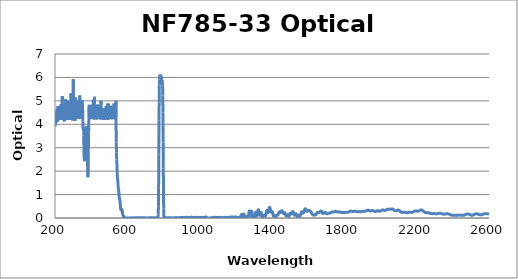
| Category | Optical Density |
|---|---|
| 2600.0 | 0.184 |
| 2599.0 | 0.183 |
| 2598.0 | 0.182 |
| 2597.0 | 0.182 |
| 2596.0 | 0.181 |
| 2595.0 | 0.18 |
| 2594.0 | 0.18 |
| 2593.0 | 0.18 |
| 2592.0 | 0.18 |
| 2591.0 | 0.18 |
| 2590.0 | 0.18 |
| 2589.0 | 0.18 |
| 2588.0 | 0.18 |
| 2587.0 | 0.181 |
| 2586.0 | 0.181 |
| 2585.0 | 0.182 |
| 2584.0 | 0.182 |
| 2583.0 | 0.182 |
| 2582.0 | 0.182 |
| 2581.0 | 0.182 |
| 2580.0 | 0.182 |
| 2579.0 | 0.181 |
| 2578.0 | 0.18 |
| 2577.0 | 0.18 |
| 2576.0 | 0.179 |
| 2575.0 | 0.178 |
| 2574.0 | 0.177 |
| 2573.0 | 0.175 |
| 2572.0 | 0.174 |
| 2571.0 | 0.172 |
| 2570.0 | 0.169 |
| 2569.0 | 0.167 |
| 2568.0 | 0.164 |
| 2567.0 | 0.161 |
| 2566.0 | 0.158 |
| 2565.0 | 0.155 |
| 2564.0 | 0.152 |
| 2563.0 | 0.149 |
| 2562.0 | 0.147 |
| 2561.0 | 0.145 |
| 2560.0 | 0.143 |
| 2559.0 | 0.141 |
| 2558.0 | 0.139 |
| 2557.0 | 0.138 |
| 2556.0 | 0.137 |
| 2555.0 | 0.137 |
| 2554.0 | 0.136 |
| 2553.0 | 0.136 |
| 2552.0 | 0.137 |
| 2551.0 | 0.138 |
| 2550.0 | 0.139 |
| 2549.0 | 0.141 |
| 2548.0 | 0.143 |
| 2547.0 | 0.145 |
| 2546.0 | 0.147 |
| 2545.0 | 0.15 |
| 2544.0 | 0.152 |
| 2543.0 | 0.155 |
| 2542.0 | 0.158 |
| 2541.0 | 0.161 |
| 2540.0 | 0.163 |
| 2539.0 | 0.166 |
| 2538.0 | 0.169 |
| 2537.0 | 0.171 |
| 2536.0 | 0.173 |
| 2535.0 | 0.175 |
| 2534.0 | 0.177 |
| 2533.0 | 0.178 |
| 2532.0 | 0.179 |
| 2531.0 | 0.18 |
| 2530.0 | 0.18 |
| 2529.0 | 0.18 |
| 2528.0 | 0.178 |
| 2527.0 | 0.177 |
| 2526.0 | 0.176 |
| 2525.0 | 0.174 |
| 2524.0 | 0.172 |
| 2523.0 | 0.169 |
| 2522.0 | 0.166 |
| 2521.0 | 0.163 |
| 2520.0 | 0.159 |
| 2519.0 | 0.155 |
| 2518.0 | 0.151 |
| 2517.0 | 0.147 |
| 2516.0 | 0.143 |
| 2515.0 | 0.139 |
| 2514.0 | 0.135 |
| 2513.0 | 0.132 |
| 2512.0 | 0.129 |
| 2511.0 | 0.126 |
| 2510.0 | 0.124 |
| 2509.0 | 0.122 |
| 2508.0 | 0.12 |
| 2507.0 | 0.119 |
| 2506.0 | 0.119 |
| 2505.0 | 0.119 |
| 2504.0 | 0.12 |
| 2503.0 | 0.121 |
| 2502.0 | 0.123 |
| 2501.0 | 0.125 |
| 2500.0 | 0.127 |
| 2499.0 | 0.13 |
| 2498.0 | 0.133 |
| 2497.0 | 0.137 |
| 2496.0 | 0.14 |
| 2495.0 | 0.144 |
| 2494.0 | 0.148 |
| 2493.0 | 0.151 |
| 2492.0 | 0.155 |
| 2491.0 | 0.159 |
| 2490.0 | 0.162 |
| 2489.0 | 0.164 |
| 2488.0 | 0.167 |
| 2487.0 | 0.17 |
| 2486.0 | 0.172 |
| 2485.0 | 0.173 |
| 2484.0 | 0.174 |
| 2483.0 | 0.175 |
| 2482.0 | 0.175 |
| 2481.0 | 0.175 |
| 2480.0 | 0.174 |
| 2479.0 | 0.173 |
| 2478.0 | 0.171 |
| 2477.0 | 0.169 |
| 2476.0 | 0.167 |
| 2475.0 | 0.164 |
| 2474.0 | 0.161 |
| 2473.0 | 0.157 |
| 2472.0 | 0.154 |
| 2471.0 | 0.15 |
| 2470.0 | 0.146 |
| 2469.0 | 0.143 |
| 2468.0 | 0.139 |
| 2467.0 | 0.135 |
| 2466.0 | 0.132 |
| 2465.0 | 0.128 |
| 2464.0 | 0.125 |
| 2463.0 | 0.122 |
| 2462.0 | 0.12 |
| 2461.0 | 0.118 |
| 2460.0 | 0.116 |
| 2459.0 | 0.115 |
| 2458.0 | 0.113 |
| 2457.0 | 0.113 |
| 2456.0 | 0.112 |
| 2455.0 | 0.112 |
| 2454.0 | 0.112 |
| 2453.0 | 0.113 |
| 2452.0 | 0.113 |
| 2451.0 | 0.114 |
| 2450.0 | 0.115 |
| 2449.0 | 0.116 |
| 2448.0 | 0.117 |
| 2447.0 | 0.118 |
| 2446.0 | 0.119 |
| 2445.0 | 0.12 |
| 2444.0 | 0.12 |
| 2443.0 | 0.121 |
| 2442.0 | 0.122 |
| 2441.0 | 0.123 |
| 2440.0 | 0.123 |
| 2439.0 | 0.124 |
| 2438.0 | 0.124 |
| 2437.0 | 0.124 |
| 2436.0 | 0.124 |
| 2435.0 | 0.124 |
| 2434.0 | 0.123 |
| 2433.0 | 0.123 |
| 2432.0 | 0.122 |
| 2431.0 | 0.121 |
| 2430.0 | 0.12 |
| 2429.0 | 0.12 |
| 2428.0 | 0.119 |
| 2427.0 | 0.118 |
| 2426.0 | 0.118 |
| 2425.0 | 0.117 |
| 2424.0 | 0.117 |
| 2423.0 | 0.117 |
| 2422.0 | 0.116 |
| 2421.0 | 0.116 |
| 2420.0 | 0.116 |
| 2419.0 | 0.116 |
| 2418.0 | 0.116 |
| 2417.0 | 0.116 |
| 2416.0 | 0.115 |
| 2415.0 | 0.115 |
| 2414.0 | 0.116 |
| 2413.0 | 0.116 |
| 2412.0 | 0.116 |
| 2411.0 | 0.116 |
| 2410.0 | 0.116 |
| 2409.0 | 0.116 |
| 2408.0 | 0.116 |
| 2407.0 | 0.116 |
| 2406.0 | 0.116 |
| 2405.0 | 0.116 |
| 2404.0 | 0.116 |
| 2403.0 | 0.116 |
| 2402.0 | 0.116 |
| 2401.0 | 0.116 |
| 2400.0 | 0.117 |
| 2399.0 | 0.117 |
| 2398.0 | 0.117 |
| 2397.0 | 0.118 |
| 2396.0 | 0.119 |
| 2395.0 | 0.12 |
| 2394.0 | 0.122 |
| 2393.0 | 0.123 |
| 2392.0 | 0.125 |
| 2391.0 | 0.127 |
| 2390.0 | 0.13 |
| 2389.0 | 0.132 |
| 2388.0 | 0.135 |
| 2387.0 | 0.139 |
| 2386.0 | 0.142 |
| 2385.0 | 0.145 |
| 2384.0 | 0.149 |
| 2383.0 | 0.152 |
| 2382.0 | 0.156 |
| 2381.0 | 0.159 |
| 2380.0 | 0.163 |
| 2379.0 | 0.166 |
| 2378.0 | 0.17 |
| 2377.0 | 0.172 |
| 2376.0 | 0.175 |
| 2375.0 | 0.177 |
| 2374.0 | 0.179 |
| 2373.0 | 0.181 |
| 2372.0 | 0.183 |
| 2371.0 | 0.184 |
| 2370.0 | 0.184 |
| 2369.0 | 0.184 |
| 2368.0 | 0.184 |
| 2367.0 | 0.183 |
| 2366.0 | 0.183 |
| 2365.0 | 0.181 |
| 2364.0 | 0.18 |
| 2363.0 | 0.178 |
| 2362.0 | 0.176 |
| 2361.0 | 0.174 |
| 2360.0 | 0.172 |
| 2359.0 | 0.169 |
| 2358.0 | 0.167 |
| 2357.0 | 0.165 |
| 2356.0 | 0.164 |
| 2355.0 | 0.162 |
| 2354.0 | 0.161 |
| 2353.0 | 0.16 |
| 2352.0 | 0.159 |
| 2351.0 | 0.159 |
| 2350.0 | 0.16 |
| 2349.0 | 0.16 |
| 2348.0 | 0.162 |
| 2347.0 | 0.163 |
| 2346.0 | 0.165 |
| 2345.0 | 0.167 |
| 2344.0 | 0.17 |
| 2343.0 | 0.173 |
| 2342.0 | 0.176 |
| 2341.0 | 0.179 |
| 2340.0 | 0.182 |
| 2339.0 | 0.185 |
| 2338.0 | 0.188 |
| 2337.0 | 0.191 |
| 2336.0 | 0.193 |
| 2335.0 | 0.196 |
| 2334.0 | 0.198 |
| 2333.0 | 0.2 |
| 2332.0 | 0.201 |
| 2331.0 | 0.202 |
| 2330.0 | 0.203 |
| 2329.0 | 0.203 |
| 2328.0 | 0.203 |
| 2327.0 | 0.203 |
| 2326.0 | 0.202 |
| 2325.0 | 0.201 |
| 2324.0 | 0.2 |
| 2323.0 | 0.198 |
| 2322.0 | 0.196 |
| 2321.0 | 0.194 |
| 2320.0 | 0.192 |
| 2319.0 | 0.19 |
| 2318.0 | 0.188 |
| 2317.0 | 0.186 |
| 2316.0 | 0.184 |
| 2315.0 | 0.183 |
| 2314.0 | 0.181 |
| 2313.0 | 0.18 |
| 2312.0 | 0.179 |
| 2311.0 | 0.178 |
| 2310.0 | 0.178 |
| 2309.0 | 0.178 |
| 2308.0 | 0.178 |
| 2307.0 | 0.179 |
| 2306.0 | 0.179 |
| 2305.0 | 0.18 |
| 2304.0 | 0.181 |
| 2303.0 | 0.182 |
| 2302.0 | 0.183 |
| 2301.0 | 0.184 |
| 2300.0 | 0.185 |
| 2299.0 | 0.186 |
| 2298.0 | 0.187 |
| 2297.0 | 0.187 |
| 2296.0 | 0.188 |
| 2295.0 | 0.188 |
| 2294.0 | 0.188 |
| 2293.0 | 0.188 |
| 2292.0 | 0.188 |
| 2291.0 | 0.188 |
| 2290.0 | 0.187 |
| 2289.0 | 0.187 |
| 2288.0 | 0.186 |
| 2287.0 | 0.186 |
| 2286.0 | 0.186 |
| 2285.0 | 0.186 |
| 2284.0 | 0.186 |
| 2283.0 | 0.186 |
| 2282.0 | 0.186 |
| 2281.0 | 0.187 |
| 2280.0 | 0.188 |
| 2279.0 | 0.19 |
| 2278.0 | 0.191 |
| 2277.0 | 0.193 |
| 2276.0 | 0.196 |
| 2275.0 | 0.198 |
| 2274.0 | 0.201 |
| 2273.0 | 0.204 |
| 2272.0 | 0.208 |
| 2271.0 | 0.211 |
| 2270.0 | 0.214 |
| 2269.0 | 0.217 |
| 2268.0 | 0.219 |
| 2267.0 | 0.222 |
| 2266.0 | 0.224 |
| 2265.0 | 0.226 |
| 2264.0 | 0.227 |
| 2263.0 | 0.228 |
| 2262.0 | 0.229 |
| 2261.0 | 0.229 |
| 2260.0 | 0.229 |
| 2259.0 | 0.229 |
| 2258.0 | 0.229 |
| 2257.0 | 0.228 |
| 2256.0 | 0.227 |
| 2255.0 | 0.226 |
| 2254.0 | 0.226 |
| 2253.0 | 0.226 |
| 2252.0 | 0.226 |
| 2251.0 | 0.226 |
| 2250.0 | 0.227 |
| 2249.0 | 0.228 |
| 2248.0 | 0.23 |
| 2247.0 | 0.232 |
| 2246.0 | 0.235 |
| 2245.0 | 0.239 |
| 2244.0 | 0.244 |
| 2243.0 | 0.249 |
| 2242.0 | 0.255 |
| 2241.0 | 0.261 |
| 2240.0 | 0.268 |
| 2239.0 | 0.275 |
| 2238.0 | 0.283 |
| 2237.0 | 0.29 |
| 2236.0 | 0.298 |
| 2235.0 | 0.305 |
| 2234.0 | 0.312 |
| 2233.0 | 0.318 |
| 2232.0 | 0.324 |
| 2231.0 | 0.329 |
| 2230.0 | 0.334 |
| 2229.0 | 0.337 |
| 2228.0 | 0.34 |
| 2227.0 | 0.342 |
| 2226.0 | 0.343 |
| 2225.0 | 0.344 |
| 2224.0 | 0.343 |
| 2223.0 | 0.342 |
| 2222.0 | 0.339 |
| 2221.0 | 0.336 |
| 2220.0 | 0.333 |
| 2219.0 | 0.329 |
| 2218.0 | 0.325 |
| 2217.0 | 0.321 |
| 2216.0 | 0.316 |
| 2215.0 | 0.312 |
| 2214.0 | 0.308 |
| 2213.0 | 0.304 |
| 2212.0 | 0.3 |
| 2211.0 | 0.297 |
| 2210.0 | 0.295 |
| 2209.0 | 0.293 |
| 2208.0 | 0.292 |
| 2207.0 | 0.291 |
| 2206.0 | 0.291 |
| 2205.0 | 0.291 |
| 2204.0 | 0.291 |
| 2203.0 | 0.293 |
| 2202.0 | 0.294 |
| 2201.0 | 0.296 |
| 2200.0 | 0.297 |
| 2199.0 | 0.299 |
| 2198.0 | 0.3 |
| 2197.0 | 0.301 |
| 2196.0 | 0.302 |
| 2195.0 | 0.302 |
| 2194.0 | 0.302 |
| 2193.0 | 0.302 |
| 2192.0 | 0.301 |
| 2191.0 | 0.3 |
| 2190.0 | 0.297 |
| 2189.0 | 0.295 |
| 2188.0 | 0.292 |
| 2187.0 | 0.288 |
| 2186.0 | 0.284 |
| 2185.0 | 0.28 |
| 2184.0 | 0.275 |
| 2183.0 | 0.27 |
| 2182.0 | 0.266 |
| 2181.0 | 0.261 |
| 2180.0 | 0.257 |
| 2179.0 | 0.253 |
| 2178.0 | 0.249 |
| 2177.0 | 0.245 |
| 2176.0 | 0.243 |
| 2175.0 | 0.241 |
| 2174.0 | 0.239 |
| 2173.0 | 0.238 |
| 2172.0 | 0.237 |
| 2171.0 | 0.238 |
| 2170.0 | 0.238 |
| 2169.0 | 0.239 |
| 2168.0 | 0.24 |
| 2167.0 | 0.241 |
| 2166.0 | 0.242 |
| 2165.0 | 0.244 |
| 2164.0 | 0.245 |
| 2163.0 | 0.246 |
| 2162.0 | 0.247 |
| 2161.0 | 0.247 |
| 2160.0 | 0.247 |
| 2159.0 | 0.247 |
| 2158.0 | 0.246 |
| 2157.0 | 0.245 |
| 2156.0 | 0.243 |
| 2155.0 | 0.241 |
| 2154.0 | 0.239 |
| 2153.0 | 0.237 |
| 2152.0 | 0.234 |
| 2151.0 | 0.232 |
| 2150.0 | 0.23 |
| 2149.0 | 0.228 |
| 2148.0 | 0.226 |
| 2147.0 | 0.225 |
| 2146.0 | 0.224 |
| 2145.0 | 0.224 |
| 2144.0 | 0.224 |
| 2143.0 | 0.225 |
| 2142.0 | 0.226 |
| 2141.0 | 0.228 |
| 2140.0 | 0.23 |
| 2139.0 | 0.232 |
| 2138.0 | 0.235 |
| 2137.0 | 0.237 |
| 2136.0 | 0.239 |
| 2135.0 | 0.242 |
| 2134.0 | 0.244 |
| 2133.0 | 0.245 |
| 2132.0 | 0.246 |
| 2131.0 | 0.247 |
| 2130.0 | 0.248 |
| 2129.0 | 0.248 |
| 2128.0 | 0.247 |
| 2127.0 | 0.246 |
| 2126.0 | 0.245 |
| 2125.0 | 0.244 |
| 2124.0 | 0.242 |
| 2123.0 | 0.24 |
| 2122.0 | 0.239 |
| 2121.0 | 0.237 |
| 2120.0 | 0.237 |
| 2119.0 | 0.236 |
| 2118.0 | 0.237 |
| 2117.0 | 0.238 |
| 2116.0 | 0.24 |
| 2115.0 | 0.243 |
| 2114.0 | 0.247 |
| 2113.0 | 0.252 |
| 2112.0 | 0.258 |
| 2111.0 | 0.264 |
| 2110.0 | 0.271 |
| 2109.0 | 0.278 |
| 2108.0 | 0.286 |
| 2107.0 | 0.294 |
| 2106.0 | 0.301 |
| 2105.0 | 0.308 |
| 2104.0 | 0.315 |
| 2103.0 | 0.321 |
| 2102.0 | 0.326 |
| 2101.0 | 0.33 |
| 2100.0 | 0.334 |
| 2099.0 | 0.336 |
| 2098.0 | 0.337 |
| 2097.0 | 0.337 |
| 2096.0 | 0.337 |
| 2095.0 | 0.336 |
| 2094.0 | 0.334 |
| 2093.0 | 0.331 |
| 2092.0 | 0.328 |
| 2091.0 | 0.324 |
| 2090.0 | 0.32 |
| 2089.0 | 0.317 |
| 2088.0 | 0.314 |
| 2087.0 | 0.311 |
| 2086.0 | 0.308 |
| 2085.0 | 0.307 |
| 2084.0 | 0.306 |
| 2083.0 | 0.306 |
| 2082.0 | 0.308 |
| 2081.0 | 0.31 |
| 2080.0 | 0.313 |
| 2079.0 | 0.317 |
| 2078.0 | 0.322 |
| 2077.0 | 0.327 |
| 2076.0 | 0.333 |
| 2075.0 | 0.339 |
| 2074.0 | 0.346 |
| 2073.0 | 0.352 |
| 2072.0 | 0.358 |
| 2071.0 | 0.363 |
| 2070.0 | 0.368 |
| 2069.0 | 0.373 |
| 2068.0 | 0.376 |
| 2067.0 | 0.379 |
| 2066.0 | 0.381 |
| 2065.0 | 0.382 |
| 2064.0 | 0.383 |
| 2063.0 | 0.383 |
| 2062.0 | 0.383 |
| 2061.0 | 0.381 |
| 2060.0 | 0.38 |
| 2059.0 | 0.379 |
| 2058.0 | 0.378 |
| 2057.0 | 0.376 |
| 2056.0 | 0.375 |
| 2055.0 | 0.374 |
| 2054.0 | 0.373 |
| 2053.0 | 0.373 |
| 2052.0 | 0.373 |
| 2051.0 | 0.373 |
| 2050.0 | 0.374 |
| 2049.0 | 0.375 |
| 2048.0 | 0.376 |
| 2047.0 | 0.377 |
| 2046.0 | 0.377 |
| 2045.0 | 0.378 |
| 2044.0 | 0.379 |
| 2043.0 | 0.379 |
| 2042.0 | 0.379 |
| 2041.0 | 0.378 |
| 2040.0 | 0.377 |
| 2039.0 | 0.375 |
| 2038.0 | 0.372 |
| 2037.0 | 0.368 |
| 2036.0 | 0.364 |
| 2035.0 | 0.36 |
| 2034.0 | 0.356 |
| 2033.0 | 0.351 |
| 2032.0 | 0.346 |
| 2031.0 | 0.341 |
| 2030.0 | 0.337 |
| 2029.0 | 0.332 |
| 2028.0 | 0.329 |
| 2027.0 | 0.327 |
| 2026.0 | 0.325 |
| 2025.0 | 0.324 |
| 2024.0 | 0.324 |
| 2023.0 | 0.325 |
| 2022.0 | 0.326 |
| 2021.0 | 0.329 |
| 2020.0 | 0.331 |
| 2019.0 | 0.334 |
| 2018.0 | 0.337 |
| 2017.0 | 0.34 |
| 2016.0 | 0.342 |
| 2015.0 | 0.344 |
| 2014.0 | 0.345 |
| 2013.0 | 0.346 |
| 2012.0 | 0.346 |
| 2011.0 | 0.345 |
| 2010.0 | 0.343 |
| 2009.0 | 0.341 |
| 2008.0 | 0.338 |
| 2007.0 | 0.333 |
| 2006.0 | 0.329 |
| 2005.0 | 0.323 |
| 2004.0 | 0.318 |
| 2003.0 | 0.312 |
| 2002.0 | 0.307 |
| 2001.0 | 0.301 |
| 2000.0 | 0.297 |
| 1999.0 | 0.293 |
| 1998.0 | 0.289 |
| 1997.0 | 0.287 |
| 1996.0 | 0.286 |
| 1995.0 | 0.287 |
| 1994.0 | 0.288 |
| 1993.0 | 0.29 |
| 1992.0 | 0.292 |
| 1991.0 | 0.295 |
| 1990.0 | 0.299 |
| 1989.0 | 0.302 |
| 1988.0 | 0.305 |
| 1987.0 | 0.308 |
| 1986.0 | 0.311 |
| 1985.0 | 0.313 |
| 1984.0 | 0.313 |
| 1983.0 | 0.314 |
| 1982.0 | 0.313 |
| 1981.0 | 0.311 |
| 1980.0 | 0.309 |
| 1979.0 | 0.306 |
| 1978.0 | 0.302 |
| 1977.0 | 0.298 |
| 1976.0 | 0.294 |
| 1975.0 | 0.29 |
| 1974.0 | 0.287 |
| 1973.0 | 0.284 |
| 1972.0 | 0.282 |
| 1971.0 | 0.28 |
| 1970.0 | 0.279 |
| 1969.0 | 0.28 |
| 1968.0 | 0.281 |
| 1967.0 | 0.283 |
| 1966.0 | 0.286 |
| 1965.0 | 0.289 |
| 1964.0 | 0.293 |
| 1963.0 | 0.297 |
| 1962.0 | 0.301 |
| 1961.0 | 0.306 |
| 1960.0 | 0.31 |
| 1959.0 | 0.313 |
| 1958.0 | 0.316 |
| 1957.0 | 0.318 |
| 1956.0 | 0.319 |
| 1955.0 | 0.319 |
| 1954.0 | 0.319 |
| 1953.0 | 0.318 |
| 1952.0 | 0.317 |
| 1951.0 | 0.315 |
| 1950.0 | 0.312 |
| 1949.0 | 0.31 |
| 1948.0 | 0.307 |
| 1947.0 | 0.306 |
| 1946.0 | 0.304 |
| 1945.0 | 0.304 |
| 1944.0 | 0.304 |
| 1943.0 | 0.304 |
| 1942.0 | 0.305 |
| 1941.0 | 0.307 |
| 1940.0 | 0.31 |
| 1939.0 | 0.313 |
| 1938.0 | 0.317 |
| 1937.0 | 0.321 |
| 1936.0 | 0.324 |
| 1935.0 | 0.327 |
| 1934.0 | 0.33 |
| 1933.0 | 0.332 |
| 1932.0 | 0.334 |
| 1931.0 | 0.334 |
| 1930.0 | 0.335 |
| 1929.0 | 0.334 |
| 1928.0 | 0.333 |
| 1927.0 | 0.331 |
| 1926.0 | 0.328 |
| 1925.0 | 0.324 |
| 1924.0 | 0.321 |
| 1923.0 | 0.316 |
| 1922.0 | 0.312 |
| 1921.0 | 0.308 |
| 1920.0 | 0.304 |
| 1919.0 | 0.301 |
| 1918.0 | 0.298 |
| 1917.0 | 0.295 |
| 1916.0 | 0.292 |
| 1915.0 | 0.291 |
| 1914.0 | 0.29 |
| 1913.0 | 0.29 |
| 1912.0 | 0.29 |
| 1911.0 | 0.291 |
| 1910.0 | 0.291 |
| 1909.0 | 0.29 |
| 1908.0 | 0.289 |
| 1907.0 | 0.289 |
| 1906.0 | 0.289 |
| 1905.0 | 0.288 |
| 1904.0 | 0.287 |
| 1903.0 | 0.286 |
| 1902.0 | 0.284 |
| 1901.0 | 0.281 |
| 1900.0 | 0.279 |
| 1899.0 | 0.276 |
| 1898.0 | 0.274 |
| 1897.0 | 0.272 |
| 1896.0 | 0.27 |
| 1895.0 | 0.268 |
| 1894.0 | 0.267 |
| 1893.0 | 0.266 |
| 1892.0 | 0.266 |
| 1891.0 | 0.267 |
| 1890.0 | 0.268 |
| 1889.0 | 0.269 |
| 1888.0 | 0.27 |
| 1887.0 | 0.27 |
| 1886.0 | 0.271 |
| 1885.0 | 0.272 |
| 1884.0 | 0.273 |
| 1883.0 | 0.273 |
| 1882.0 | 0.273 |
| 1881.0 | 0.273 |
| 1880.0 | 0.272 |
| 1879.0 | 0.27 |
| 1878.0 | 0.269 |
| 1877.0 | 0.267 |
| 1876.0 | 0.266 |
| 1875.0 | 0.265 |
| 1874.0 | 0.265 |
| 1873.0 | 0.265 |
| 1872.0 | 0.266 |
| 1871.0 | 0.267 |
| 1870.0 | 0.268 |
| 1869.0 | 0.271 |
| 1868.0 | 0.273 |
| 1867.0 | 0.275 |
| 1866.0 | 0.278 |
| 1865.0 | 0.28 |
| 1864.0 | 0.282 |
| 1863.0 | 0.284 |
| 1862.0 | 0.286 |
| 1861.0 | 0.288 |
| 1860.0 | 0.29 |
| 1859.0 | 0.292 |
| 1858.0 | 0.292 |
| 1857.0 | 0.291 |
| 1856.0 | 0.29 |
| 1855.0 | 0.288 |
| 1854.0 | 0.286 |
| 1853.0 | 0.284 |
| 1852.0 | 0.283 |
| 1851.0 | 0.281 |
| 1850.0 | 0.278 |
| 1849.0 | 0.277 |
| 1848.0 | 0.276 |
| 1847.0 | 0.278 |
| 1846.0 | 0.28 |
| 1845.0 | 0.281 |
| 1844.0 | 0.281 |
| 1843.0 | 0.282 |
| 1842.0 | 0.283 |
| 1841.0 | 0.287 |
| 1840.0 | 0.29 |
| 1839.0 | 0.294 |
| 1838.0 | 0.295 |
| 1837.0 | 0.296 |
| 1836.0 | 0.296 |
| 1835.0 | 0.296 |
| 1834.0 | 0.295 |
| 1833.0 | 0.293 |
| 1832.0 | 0.289 |
| 1831.0 | 0.285 |
| 1830.0 | 0.282 |
| 1829.0 | 0.278 |
| 1828.0 | 0.274 |
| 1827.0 | 0.269 |
| 1826.0 | 0.264 |
| 1825.0 | 0.26 |
| 1824.0 | 0.256 |
| 1823.0 | 0.253 |
| 1822.0 | 0.25 |
| 1821.0 | 0.248 |
| 1820.0 | 0.246 |
| 1819.0 | 0.245 |
| 1818.0 | 0.245 |
| 1817.0 | 0.243 |
| 1816.0 | 0.242 |
| 1815.0 | 0.242 |
| 1814.0 | 0.242 |
| 1813.0 | 0.241 |
| 1812.0 | 0.241 |
| 1811.0 | 0.241 |
| 1810.0 | 0.24 |
| 1809.0 | 0.24 |
| 1808.0 | 0.239 |
| 1807.0 | 0.238 |
| 1806.0 | 0.238 |
| 1805.0 | 0.238 |
| 1804.0 | 0.238 |
| 1803.0 | 0.238 |
| 1802.0 | 0.238 |
| 1801.0 | 0.238 |
| 1800.0 | 0.239 |
| 1799.0 | 0.239 |
| 1798.0 | 0.24 |
| 1797.0 | 0.24 |
| 1796.0 | 0.239 |
| 1795.0 | 0.239 |
| 1794.0 | 0.238 |
| 1793.0 | 0.237 |
| 1792.0 | 0.236 |
| 1791.0 | 0.235 |
| 1790.0 | 0.234 |
| 1789.0 | 0.233 |
| 1788.0 | 0.232 |
| 1787.0 | 0.231 |
| 1786.0 | 0.231 |
| 1785.0 | 0.232 |
| 1784.0 | 0.233 |
| 1783.0 | 0.235 |
| 1782.0 | 0.238 |
| 1781.0 | 0.241 |
| 1780.0 | 0.244 |
| 1779.0 | 0.248 |
| 1778.0 | 0.251 |
| 1777.0 | 0.254 |
| 1776.0 | 0.257 |
| 1775.0 | 0.259 |
| 1774.0 | 0.261 |
| 1773.0 | 0.262 |
| 1772.0 | 0.262 |
| 1771.0 | 0.262 |
| 1770.0 | 0.261 |
| 1769.0 | 0.259 |
| 1768.0 | 0.257 |
| 1767.0 | 0.256 |
| 1766.0 | 0.254 |
| 1765.0 | 0.254 |
| 1764.0 | 0.253 |
| 1763.0 | 0.254 |
| 1762.0 | 0.255 |
| 1761.0 | 0.258 |
| 1760.0 | 0.261 |
| 1759.0 | 0.265 |
| 1758.0 | 0.269 |
| 1757.0 | 0.273 |
| 1756.0 | 0.277 |
| 1755.0 | 0.281 |
| 1754.0 | 0.285 |
| 1753.0 | 0.287 |
| 1752.0 | 0.288 |
| 1751.0 | 0.288 |
| 1750.0 | 0.288 |
| 1749.0 | 0.286 |
| 1748.0 | 0.283 |
| 1747.0 | 0.279 |
| 1746.0 | 0.275 |
| 1745.0 | 0.271 |
| 1744.0 | 0.268 |
| 1743.0 | 0.264 |
| 1742.0 | 0.261 |
| 1741.0 | 0.259 |
| 1740.0 | 0.258 |
| 1739.0 | 0.258 |
| 1738.0 | 0.258 |
| 1737.0 | 0.258 |
| 1736.0 | 0.259 |
| 1735.0 | 0.259 |
| 1734.0 | 0.259 |
| 1733.0 | 0.259 |
| 1732.0 | 0.258 |
| 1731.0 | 0.256 |
| 1730.0 | 0.252 |
| 1729.0 | 0.248 |
| 1728.0 | 0.244 |
| 1727.0 | 0.238 |
| 1726.0 | 0.233 |
| 1725.0 | 0.227 |
| 1724.0 | 0.222 |
| 1723.0 | 0.217 |
| 1722.0 | 0.213 |
| 1721.0 | 0.21 |
| 1720.0 | 0.208 |
| 1719.0 | 0.206 |
| 1718.0 | 0.206 |
| 1717.0 | 0.206 |
| 1716.0 | 0.206 |
| 1715.0 | 0.206 |
| 1714.0 | 0.206 |
| 1713.0 | 0.205 |
| 1712.0 | 0.202 |
| 1711.0 | 0.199 |
| 1710.0 | 0.196 |
| 1709.0 | 0.191 |
| 1708.0 | 0.187 |
| 1707.0 | 0.182 |
| 1706.0 | 0.179 |
| 1705.0 | 0.177 |
| 1704.0 | 0.176 |
| 1703.0 | 0.178 |
| 1702.0 | 0.182 |
| 1701.0 | 0.188 |
| 1700.0 | 0.195 |
| 1699.0 | 0.203 |
| 1698.0 | 0.212 |
| 1697.0 | 0.221 |
| 1696.0 | 0.23 |
| 1695.0 | 0.237 |
| 1694.0 | 0.242 |
| 1693.0 | 0.244 |
| 1692.0 | 0.245 |
| 1691.0 | 0.243 |
| 1690.0 | 0.238 |
| 1689.0 | 0.231 |
| 1688.0 | 0.223 |
| 1687.0 | 0.215 |
| 1686.0 | 0.206 |
| 1685.0 | 0.198 |
| 1684.0 | 0.193 |
| 1683.0 | 0.19 |
| 1682.0 | 0.19 |
| 1681.0 | 0.194 |
| 1680.0 | 0.202 |
| 1679.0 | 0.213 |
| 1678.0 | 0.225 |
| 1677.0 | 0.239 |
| 1676.0 | 0.254 |
| 1675.0 | 0.268 |
| 1674.0 | 0.28 |
| 1673.0 | 0.289 |
| 1672.0 | 0.295 |
| 1671.0 | 0.299 |
| 1670.0 | 0.298 |
| 1669.0 | 0.295 |
| 1668.0 | 0.289 |
| 1667.0 | 0.28 |
| 1666.0 | 0.271 |
| 1665.0 | 0.261 |
| 1664.0 | 0.251 |
| 1663.0 | 0.243 |
| 1662.0 | 0.236 |
| 1661.0 | 0.231 |
| 1660.0 | 0.229 |
| 1659.0 | 0.229 |
| 1658.0 | 0.231 |
| 1657.0 | 0.234 |
| 1656.0 | 0.238 |
| 1655.0 | 0.24 |
| 1654.0 | 0.242 |
| 1653.0 | 0.242 |
| 1652.0 | 0.24 |
| 1651.0 | 0.236 |
| 1650.0 | 0.229 |
| 1649.0 | 0.22 |
| 1648.0 | 0.209 |
| 1647.0 | 0.197 |
| 1646.0 | 0.184 |
| 1645.0 | 0.171 |
| 1644.0 | 0.16 |
| 1643.0 | 0.15 |
| 1642.0 | 0.141 |
| 1641.0 | 0.135 |
| 1640.0 | 0.132 |
| 1639.0 | 0.131 |
| 1638.0 | 0.131 |
| 1637.0 | 0.132 |
| 1636.0 | 0.134 |
| 1635.0 | 0.135 |
| 1634.0 | 0.135 |
| 1633.0 | 0.134 |
| 1632.0 | 0.132 |
| 1631.0 | 0.13 |
| 1630.0 | 0.127 |
| 1629.0 | 0.125 |
| 1628.0 | 0.124 |
| 1627.0 | 0.125 |
| 1626.0 | 0.129 |
| 1625.0 | 0.135 |
| 1624.0 | 0.144 |
| 1623.0 | 0.155 |
| 1622.0 | 0.168 |
| 1621.0 | 0.182 |
| 1620.0 | 0.197 |
| 1619.0 | 0.212 |
| 1618.0 | 0.226 |
| 1617.0 | 0.239 |
| 1616.0 | 0.25 |
| 1615.0 | 0.26 |
| 1614.0 | 0.27 |
| 1613.0 | 0.278 |
| 1612.0 | 0.285 |
| 1611.0 | 0.292 |
| 1610.0 | 0.298 |
| 1609.0 | 0.304 |
| 1608.0 | 0.309 |
| 1607.0 | 0.314 |
| 1606.0 | 0.319 |
| 1605.0 | 0.322 |
| 1604.0 | 0.323 |
| 1603.0 | 0.324 |
| 1602.0 | 0.322 |
| 1601.0 | 0.319 |
| 1600.0 | 0.313 |
| 1599.0 | 0.307 |
| 1598.0 | 0.3 |
| 1597.0 | 0.293 |
| 1596.0 | 0.288 |
| 1595.0 | 0.285 |
| 1594.0 | 0.285 |
| 1593.0 | 0.289 |
| 1592.0 | 0.298 |
| 1591.0 | 0.31 |
| 1590.0 | 0.324 |
| 1589.0 | 0.34 |
| 1588.0 | 0.356 |
| 1587.0 | 0.37 |
| 1586.0 | 0.381 |
| 1585.0 | 0.388 |
| 1584.0 | 0.391 |
| 1583.0 | 0.388 |
| 1582.0 | 0.378 |
| 1581.0 | 0.364 |
| 1580.0 | 0.345 |
| 1579.0 | 0.323 |
| 1578.0 | 0.298 |
| 1577.0 | 0.274 |
| 1576.0 | 0.251 |
| 1575.0 | 0.233 |
| 1574.0 | 0.219 |
| 1573.0 | 0.213 |
| 1572.0 | 0.213 |
| 1571.0 | 0.219 |
| 1570.0 | 0.229 |
| 1569.0 | 0.241 |
| 1568.0 | 0.254 |
| 1567.0 | 0.264 |
| 1566.0 | 0.27 |
| 1565.0 | 0.271 |
| 1564.0 | 0.266 |
| 1563.0 | 0.254 |
| 1562.0 | 0.236 |
| 1561.0 | 0.213 |
| 1560.0 | 0.186 |
| 1559.0 | 0.158 |
| 1558.0 | 0.132 |
| 1557.0 | 0.109 |
| 1556.0 | 0.093 |
| 1555.0 | 0.084 |
| 1554.0 | 0.083 |
| 1553.0 | 0.087 |
| 1552.0 | 0.096 |
| 1551.0 | 0.105 |
| 1550.0 | 0.114 |
| 1549.0 | 0.119 |
| 1548.0 | 0.12 |
| 1547.0 | 0.116 |
| 1546.0 | 0.107 |
| 1545.0 | 0.095 |
| 1544.0 | 0.081 |
| 1543.0 | 0.069 |
| 1542.0 | 0.061 |
| 1541.0 | 0.058 |
| 1540.0 | 0.063 |
| 1539.0 | 0.074 |
| 1538.0 | 0.09 |
| 1537.0 | 0.11 |
| 1536.0 | 0.13 |
| 1535.0 | 0.15 |
| 1534.0 | 0.166 |
| 1533.0 | 0.177 |
| 1532.0 | 0.182 |
| 1531.0 | 0.18 |
| 1530.0 | 0.173 |
| 1529.0 | 0.162 |
| 1528.0 | 0.148 |
| 1527.0 | 0.135 |
| 1526.0 | 0.124 |
| 1525.0 | 0.119 |
| 1524.0 | 0.122 |
| 1523.0 | 0.132 |
| 1522.0 | 0.15 |
| 1521.0 | 0.172 |
| 1520.0 | 0.199 |
| 1519.0 | 0.223 |
| 1518.0 | 0.244 |
| 1517.0 | 0.26 |
| 1516.0 | 0.269 |
| 1515.0 | 0.27 |
| 1514.0 | 0.264 |
| 1513.0 | 0.252 |
| 1512.0 | 0.235 |
| 1511.0 | 0.216 |
| 1510.0 | 0.197 |
| 1509.0 | 0.182 |
| 1508.0 | 0.171 |
| 1507.0 | 0.168 |
| 1506.0 | 0.171 |
| 1505.0 | 0.178 |
| 1504.0 | 0.188 |
| 1503.0 | 0.198 |
| 1502.0 | 0.206 |
| 1501.0 | 0.207 |
| 1500.0 | 0.203 |
| 1499.0 | 0.193 |
| 1498.0 | 0.177 |
| 1497.0 | 0.155 |
| 1496.0 | 0.13 |
| 1495.0 | 0.106 |
| 1494.0 | 0.085 |
| 1493.0 | 0.069 |
| 1492.0 | 0.061 |
| 1491.0 | 0.062 |
| 1490.0 | 0.071 |
| 1489.0 | 0.085 |
| 1488.0 | 0.103 |
| 1487.0 | 0.118 |
| 1486.0 | 0.131 |
| 1485.0 | 0.139 |
| 1484.0 | 0.14 |
| 1483.0 | 0.136 |
| 1482.0 | 0.127 |
| 1481.0 | 0.116 |
| 1480.0 | 0.105 |
| 1479.0 | 0.098 |
| 1478.0 | 0.097 |
| 1477.0 | 0.104 |
| 1476.0 | 0.119 |
| 1475.0 | 0.139 |
| 1474.0 | 0.163 |
| 1473.0 | 0.185 |
| 1472.0 | 0.205 |
| 1471.0 | 0.219 |
| 1470.0 | 0.228 |
| 1469.0 | 0.229 |
| 1468.0 | 0.225 |
| 1467.0 | 0.216 |
| 1466.0 | 0.206 |
| 1465.0 | 0.198 |
| 1464.0 | 0.194 |
| 1463.0 | 0.196 |
| 1462.0 | 0.205 |
| 1461.0 | 0.22 |
| 1460.0 | 0.24 |
| 1459.0 | 0.262 |
| 1458.0 | 0.281 |
| 1457.0 | 0.297 |
| 1456.0 | 0.309 |
| 1455.0 | 0.314 |
| 1454.0 | 0.313 |
| 1453.0 | 0.305 |
| 1452.0 | 0.294 |
| 1451.0 | 0.279 |
| 1450.0 | 0.264 |
| 1449.0 | 0.251 |
| 1448.0 | 0.242 |
| 1447.0 | 0.238 |
| 1446.0 | 0.239 |
| 1445.0 | 0.245 |
| 1444.0 | 0.252 |
| 1443.0 | 0.26 |
| 1442.0 | 0.265 |
| 1441.0 | 0.265 |
| 1440.0 | 0.26 |
| 1439.0 | 0.248 |
| 1438.0 | 0.232 |
| 1437.0 | 0.212 |
| 1436.0 | 0.19 |
| 1435.0 | 0.171 |
| 1434.0 | 0.153 |
| 1433.0 | 0.141 |
| 1432.0 | 0.133 |
| 1431.0 | 0.13 |
| 1430.0 | 0.129 |
| 1429.0 | 0.128 |
| 1428.0 | 0.125 |
| 1427.0 | 0.118 |
| 1426.0 | 0.108 |
| 1425.0 | 0.096 |
| 1424.0 | 0.082 |
| 1423.0 | 0.07 |
| 1422.0 | 0.063 |
| 1421.0 | 0.061 |
| 1420.0 | 0.065 |
| 1419.0 | 0.075 |
| 1418.0 | 0.088 |
| 1417.0 | 0.099 |
| 1416.0 | 0.109 |
| 1415.0 | 0.113 |
| 1414.0 | 0.111 |
| 1413.0 | 0.103 |
| 1412.0 | 0.093 |
| 1411.0 | 0.081 |
| 1410.0 | 0.072 |
| 1409.0 | 0.072 |
| 1408.0 | 0.081 |
| 1407.0 | 0.101 |
| 1406.0 | 0.129 |
| 1405.0 | 0.164 |
| 1404.0 | 0.202 |
| 1403.0 | 0.235 |
| 1402.0 | 0.26 |
| 1401.0 | 0.274 |
| 1400.0 | 0.28 |
| 1399.0 | 0.278 |
| 1398.0 | 0.269 |
| 1397.0 | 0.257 |
| 1396.0 | 0.248 |
| 1395.0 | 0.249 |
| 1394.0 | 0.262 |
| 1393.0 | 0.284 |
| 1392.0 | 0.32 |
| 1391.0 | 0.359 |
| 1390.0 | 0.394 |
| 1389.0 | 0.423 |
| 1388.0 | 0.444 |
| 1387.0 | 0.455 |
| 1386.0 | 0.45 |
| 1385.0 | 0.432 |
| 1384.0 | 0.401 |
| 1383.0 | 0.36 |
| 1382.0 | 0.315 |
| 1381.0 | 0.276 |
| 1380.0 | 0.247 |
| 1379.0 | 0.23 |
| 1378.0 | 0.23 |
| 1377.0 | 0.242 |
| 1376.0 | 0.263 |
| 1375.0 | 0.286 |
| 1374.0 | 0.308 |
| 1373.0 | 0.321 |
| 1372.0 | 0.323 |
| 1371.0 | 0.313 |
| 1370.0 | 0.292 |
| 1369.0 | 0.262 |
| 1368.0 | 0.223 |
| 1367.0 | 0.18 |
| 1366.0 | 0.142 |
| 1365.0 | 0.11 |
| 1364.0 | 0.088 |
| 1363.0 | 0.078 |
| 1362.0 | 0.081 |
| 1361.0 | 0.09 |
| 1360.0 | 0.102 |
| 1359.0 | 0.113 |
| 1358.0 | 0.119 |
| 1357.0 | 0.121 |
| 1356.0 | 0.117 |
| 1355.0 | 0.11 |
| 1354.0 | 0.101 |
| 1353.0 | 0.09 |
| 1352.0 | 0.077 |
| 1351.0 | 0.064 |
| 1350.0 | 0.052 |
| 1349.0 | 0.043 |
| 1348.0 | 0.037 |
| 1347.0 | 0.039 |
| 1346.0 | 0.048 |
| 1345.0 | 0.068 |
| 1344.0 | 0.096 |
| 1343.0 | 0.129 |
| 1342.0 | 0.166 |
| 1341.0 | 0.199 |
| 1340.0 | 0.224 |
| 1339.0 | 0.239 |
| 1338.0 | 0.242 |
| 1337.0 | 0.231 |
| 1336.0 | 0.209 |
| 1335.0 | 0.18 |
| 1334.0 | 0.149 |
| 1333.0 | 0.126 |
| 1332.0 | 0.118 |
| 1331.0 | 0.13 |
| 1330.0 | 0.16 |
| 1329.0 | 0.204 |
| 1328.0 | 0.254 |
| 1327.0 | 0.3 |
| 1326.0 | 0.335 |
| 1325.0 | 0.354 |
| 1324.0 | 0.353 |
| 1323.0 | 0.333 |
| 1322.0 | 0.294 |
| 1321.0 | 0.243 |
| 1320.0 | 0.187 |
| 1319.0 | 0.14 |
| 1318.0 | 0.111 |
| 1317.0 | 0.109 |
| 1316.0 | 0.131 |
| 1315.0 | 0.169 |
| 1314.0 | 0.21 |
| 1313.0 | 0.242 |
| 1312.0 | 0.257 |
| 1311.0 | 0.252 |
| 1310.0 | 0.226 |
| 1309.0 | 0.184 |
| 1308.0 | 0.131 |
| 1307.0 | 0.081 |
| 1306.0 | 0.042 |
| 1305.0 | 0.023 |
| 1304.0 | 0.026 |
| 1303.0 | 0.045 |
| 1302.0 | 0.069 |
| 1301.0 | 0.089 |
| 1300.0 | 0.096 |
| 1299.0 | 0.089 |
| 1298.0 | 0.069 |
| 1297.0 | 0.044 |
| 1296.0 | 0.025 |
| 1295.0 | 0.022 |
| 1294.0 | 0.04 |
| 1293.0 | 0.078 |
| 1292.0 | 0.131 |
| 1291.0 | 0.187 |
| 1290.0 | 0.237 |
| 1289.0 | 0.272 |
| 1288.0 | 0.287 |
| 1287.0 | 0.28 |
| 1286.0 | 0.254 |
| 1285.0 | 0.211 |
| 1284.0 | 0.163 |
| 1283.0 | 0.123 |
| 1282.0 | 0.102 |
| 1281.0 | 0.106 |
| 1280.0 | 0.136 |
| 1279.0 | 0.183 |
| 1278.0 | 0.232 |
| 1277.0 | 0.273 |
| 1276.0 | 0.299 |
| 1275.0 | 0.304 |
| 1274.0 | 0.29 |
| 1273.0 | 0.258 |
| 1272.0 | 0.214 |
| 1271.0 | 0.164 |
| 1270.0 | 0.12 |
| 1269.0 | 0.087 |
| 1268.0 | 0.068 |
| 1267.0 | 0.063 |
| 1266.0 | 0.067 |
| 1265.0 | 0.072 |
| 1264.0 | 0.075 |
| 1263.0 | 0.072 |
| 1262.0 | 0.062 |
| 1261.0 | 0.049 |
| 1260.0 | 0.034 |
| 1259.0 | 0.022 |
| 1258.0 | 0.013 |
| 1257.0 | 0.008 |
| 1256.0 | 0.006 |
| 1255.0 | 0.005 |
| 1254.0 | 0.004 |
| 1253.0 | 0.005 |
| 1252.0 | 0.009 |
| 1251.0 | 0.02 |
| 1250.0 | 0.037 |
| 1249.0 | 0.062 |
| 1248.0 | 0.092 |
| 1247.0 | 0.121 |
| 1246.0 | 0.147 |
| 1245.0 | 0.164 |
| 1244.0 | 0.168 |
| 1243.0 | 0.159 |
| 1242.0 | 0.137 |
| 1241.0 | 0.108 |
| 1240.0 | 0.077 |
| 1239.0 | 0.054 |
| 1238.0 | 0.045 |
| 1237.0 | 0.053 |
| 1236.0 | 0.074 |
| 1235.0 | 0.102 |
| 1234.0 | 0.129 |
| 1233.0 | 0.147 |
| 1232.0 | 0.152 |
| 1231.0 | 0.144 |
| 1230.0 | 0.125 |
| 1229.0 | 0.097 |
| 1228.0 | 0.069 |
| 1227.0 | 0.044 |
| 1226.0 | 0.027 |
| 1225.0 | 0.02 |
| 1224.0 | 0.022 |
| 1223.0 | 0.028 |
| 1222.0 | 0.035 |
| 1221.0 | 0.039 |
| 1220.0 | 0.04 |
| 1219.0 | 0.037 |
| 1218.0 | 0.034 |
| 1217.0 | 0.03 |
| 1216.0 | 0.027 |
| 1215.0 | 0.026 |
| 1214.0 | 0.026 |
| 1213.0 | 0.026 |
| 1212.0 | 0.026 |
| 1211.0 | 0.023 |
| 1210.0 | 0.019 |
| 1209.0 | 0.015 |
| 1208.0 | 0.013 |
| 1207.0 | 0.014 |
| 1206.0 | 0.018 |
| 1205.0 | 0.024 |
| 1204.0 | 0.032 |
| 1203.0 | 0.038 |
| 1202.0 | 0.041 |
| 1201.0 | 0.04 |
| 1200.0 | 0.033 |
| 1199.0 | 0.024 |
| 1198.0 | 0.015 |
| 1197.0 | 0.008 |
| 1196.0 | 0.007 |
| 1195.0 | 0.013 |
| 1194.0 | 0.022 |
| 1193.0 | 0.033 |
| 1192.0 | 0.042 |
| 1191.0 | 0.047 |
| 1190.0 | 0.047 |
| 1189.0 | 0.041 |
| 1188.0 | 0.033 |
| 1187.0 | 0.024 |
| 1186.0 | 0.018 |
| 1185.0 | 0.016 |
| 1184.0 | 0.019 |
| 1183.0 | 0.027 |
| 1182.0 | 0.035 |
| 1181.0 | 0.041 |
| 1180.0 | 0.044 |
| 1179.0 | 0.043 |
| 1178.0 | 0.038 |
| 1177.0 | 0.03 |
| 1176.0 | 0.024 |
| 1175.0 | 0.02 |
| 1174.0 | 0.021 |
| 1173.0 | 0.026 |
| 1172.0 | 0.032 |
| 1171.0 | 0.038 |
| 1170.0 | 0.042 |
| 1169.0 | 0.041 |
| 1168.0 | 0.037 |
| 1167.0 | 0.03 |
| 1166.0 | 0.023 |
| 1165.0 | 0.019 |
| 1164.0 | 0.019 |
| 1163.0 | 0.022 |
| 1162.0 | 0.026 |
| 1161.0 | 0.03 |
| 1160.0 | 0.031 |
| 1159.0 | 0.028 |
| 1158.0 | 0.022 |
| 1157.0 | 0.016 |
| 1156.0 | 0.013 |
| 1155.0 | 0.012 |
| 1154.0 | 0.016 |
| 1153.0 | 0.021 |
| 1152.0 | 0.025 |
| 1151.0 | 0.026 |
| 1150.0 | 0.022 |
| 1149.0 | 0.016 |
| 1148.0 | 0.01 |
| 1147.0 | 0.007 |
| 1146.0 | 0.009 |
| 1145.0 | 0.015 |
| 1144.0 | 0.022 |
| 1143.0 | 0.028 |
| 1142.0 | 0.031 |
| 1141.0 | 0.028 |
| 1140.0 | 0.022 |
| 1139.0 | 0.015 |
| 1138.0 | 0.01 |
| 1137.0 | 0.008 |
| 1136.0 | 0.011 |
| 1135.0 | 0.016 |
| 1134.0 | 0.021 |
| 1133.0 | 0.024 |
| 1132.0 | 0.023 |
| 1131.0 | 0.019 |
| 1130.0 | 0.013 |
| 1129.0 | 0.008 |
| 1128.0 | 0.006 |
| 1127.0 | 0.008 |
| 1126.0 | 0.011 |
| 1125.0 | 0.014 |
| 1124.0 | 0.016 |
| 1123.0 | 0.015 |
| 1122.0 | 0.013 |
| 1121.0 | 0.012 |
| 1120.0 | 0.013 |
| 1119.0 | 0.017 |
| 1118.0 | 0.023 |
| 1117.0 | 0.027 |
| 1116.0 | 0.027 |
| 1115.0 | 0.022 |
| 1114.0 | 0.015 |
| 1113.0 | 0.009 |
| 1112.0 | 0.007 |
| 1111.0 | 0.01 |
| 1110.0 | 0.016 |
| 1109.0 | 0.024 |
| 1108.0 | 0.027 |
| 1107.0 | 0.026 |
| 1106.0 | 0.02 |
| 1105.0 | 0.013 |
| 1104.0 | 0.008 |
| 1103.0 | 0.008 |
| 1102.0 | 0.013 |
| 1101.0 | 0.02 |
| 1100.0 | 0.027 |
| 1099.0 | 0.029 |
| 1098.0 | 0.026 |
| 1097.0 | 0.018 |
| 1096.0 | 0.011 |
| 1095.0 | 0.007 |
| 1094.0 | 0.008 |
| 1093.0 | 0.013 |
| 1092.0 | 0.02 |
| 1091.0 | 0.024 |
| 1090.0 | 0.023 |
| 1089.0 | 0.018 |
| 1088.0 | 0.012 |
| 1087.0 | 0.007 |
| 1086.0 | 0.008 |
| 1085.0 | 0.015 |
| 1084.0 | 0.025 |
| 1083.0 | 0.034 |
| 1082.0 | 0.038 |
| 1081.0 | 0.035 |
| 1080.0 | 0.026 |
| 1079.0 | 0.016 |
| 1078.0 | 0.009 |
| 1077.0 | 0.007 |
| 1076.0 | 0.009 |
| 1075.0 | 0.015 |
| 1074.0 | 0.02 |
| 1073.0 | 0.021 |
| 1072.0 | 0.02 |
| 1071.0 | 0.015 |
| 1070.0 | 0.011 |
| 1069.0 | 0.008 |
| 1068.0 | 0.007 |
| 1067.0 | 0.008 |
| 1066.0 | 0.008 |
| 1065.0 | 0.008 |
| 1064.0 | 0.007 |
| 1063.0 | 0.005 |
| 1062.0 | 0.004 |
| 1061.0 | 0.003 |
| 1060.0 | 0.003 |
| 1059.0 | 0.003 |
| 1058.0 | 0.004 |
| 1057.0 | 0.004 |
| 1056.0 | 0.004 |
| 1055.0 | 0.004 |
| 1054.0 | 0.004 |
| 1053.0 | 0.004 |
| 1052.0 | 0.003 |
| 1051.0 | 0.003 |
| 1050.0 | 0.003 |
| 1049.0 | 0.003 |
| 1048.0 | 0.002 |
| 1047.0 | 0.002 |
| 1046.0 | 0.002 |
| 1045.0 | 0.002 |
| 1044.0 | 0.002 |
| 1043.0 | 0.003 |
| 1042.0 | 0.003 |
| 1041.0 | 0.003 |
| 1040.0 | 0.001 |
| 1039.0 | 0.004 |
| 1038.0 | 0.001 |
| 1037.0 | 0.036 |
| 1036.0 | 0.041 |
| 1035.0 | 0.003 |
| 1034.0 | 0.009 |
| 1033.0 | 0.008 |
| 1032.0 | 0.009 |
| 1031.0 | 0.013 |
| 1030.0 | 0.027 |
| 1029.0 | 0.03 |
| 1028.0 | 0.034 |
| 1027.0 | 0 |
| 1026.0 | 0.016 |
| 1025.0 | 0.008 |
| 1024.0 | 0.008 |
| 1023.0 | 0.022 |
| 1022.0 | 0.029 |
| 1021.0 | 0.024 |
| 1020.0 | 0.006 |
| 1019.0 | 0.009 |
| 1018.0 | 0.009 |
| 1017.0 | 0.008 |
| 1016.0 | 0.02 |
| 1015.0 | 0.022 |
| 1014.0 | 0.005 |
| 1013.0 | 0.008 |
| 1012.0 | 0.005 |
| 1011.0 | 0.004 |
| 1010.0 | 0.019 |
| 1009.0 | 0.024 |
| 1008.0 | 0 |
| 1007.0 | 0.005 |
| 1006.0 | 0.01 |
| 1005.0 | 0.011 |
| 1004.0 | 0.022 |
| 1003.0 | 0.023 |
| 1002.0 | 0.002 |
| 1001.0 | 0.006 |
| 1000.0 | 0.003 |
| 999.0 | 0.019 |
| 998.0 | 0.026 |
| 997.0 | 0.003 |
| 996.0 | 0.014 |
| 995.0 | 0.001 |
| 994.0 | 0.021 |
| 993.0 | 0.024 |
| 992.0 | 0.004 |
| 991.0 | 0.015 |
| 990.0 | 0.009 |
| 989.0 | 0.017 |
| 988.0 | 0.03 |
| 987.0 | 0.001 |
| 986.0 | 0.006 |
| 985.0 | 0.004 |
| 984.0 | 0.019 |
| 983.0 | 0.003 |
| 982.0 | 0.007 |
| 981.0 | 0 |
| 980.0 | 0.018 |
| 979.0 | 0.003 |
| 978.0 | 0.001 |
| 977.0 | 0.023 |
| 976.0 | 0.03 |
| 975.0 | 0 |
| 974.0 | 0.005 |
| 973.0 | 0.015 |
| 972.0 | 0.003 |
| 971.0 | 0.009 |
| 970.0 | 0.005 |
| 969.0 | 0.018 |
| 968.0 | 0.004 |
| 967.0 | 0.003 |
| 966.0 | 0.006 |
| 965.0 | 0.008 |
| 964.0 | 0.003 |
| 963.0 | 0.023 |
| 962.0 | 0.004 |
| 961.0 | 0.02 |
| 960.0 | 0.002 |
| 959.0 | 0.03 |
| 958.0 | 0.031 |
| 957.0 | 0 |
| 956.0 | 0.018 |
| 955.0 | 0 |
| 954.0 | 0.031 |
| 953.0 | 0.034 |
| 952.0 | 0.003 |
| 951.0 | 0.028 |
| 950.0 | 0.004 |
| 949.0 | 0.029 |
| 948.0 | 0.032 |
| 947.0 | 0.001 |
| 946.0 | 0.012 |
| 945.0 | 0.001 |
| 944.0 | 0.022 |
| 943.0 | 0.011 |
| 942.0 | 0.001 |
| 941.0 | 0.011 |
| 940.0 | 0.025 |
| 939.0 | 0.001 |
| 938.0 | 0.02 |
| 937.0 | 0.005 |
| 936.0 | 0.016 |
| 935.0 | 0.003 |
| 934.0 | 0.003 |
| 933.0 | 0.009 |
| 932.0 | 0.032 |
| 931.0 | 0.026 |
| 930.0 | 0.005 |
| 929.0 | 0.026 |
| 928.0 | 0.011 |
| 927.0 | 0.007 |
| 926.0 | 0.017 |
| 925.0 | 0.003 |
| 924.0 | 0.012 |
| 923.0 | 0.003 |
| 922.0 | 0.029 |
| 921.0 | 0.029 |
| 920.0 | 0.001 |
| 919.0 | 0.016 |
| 918.0 | 0.001 |
| 917.0 | 0.004 |
| 916.0 | 0.007 |
| 915.0 | 0.02 |
| 914.0 | 0.009 |
| 913.0 | 0.01 |
| 912.0 | 0.005 |
| 911.0 | 0.01 |
| 910.0 | 0.004 |
| 909.0 | 0.011 |
| 908.0 | 0.022 |
| 907.0 | 0.01 |
| 906.0 | 0.004 |
| 905.0 | 0.006 |
| 904.0 | 0.002 |
| 903.0 | 0 |
| 902.0 | 0.002 |
| 901.0 | 0.017 |
| 900.0 | 0.027 |
| 899.0 | 0.006 |
| 898.0 | 0.018 |
| 897.0 | 0.011 |
| 896.0 | 0.017 |
| 895.0 | 0.013 |
| 894.0 | 0.003 |
| 893.0 | 0.011 |
| 892.0 | 0.006 |
| 891.0 | 0.007 |
| 890.0 | 0.021 |
| 889.0 | 0.017 |
| 888.0 | 0.009 |
| 887.0 | 0.006 |
| 886.0 | 0.011 |
| 885.0 | 0.011 |
| 884.0 | 0.004 |
| 883.0 | 0.005 |
| 882.0 | 0.006 |
| 881.0 | 0.007 |
| 880.0 | 0.01 |
| 879.0 | 0.013 |
| 878.0 | 0.011 |
| 877.0 | 0.003 |
| 876.0 | 0.002 |
| 875.0 | 0.008 |
| 874.0 | 0.007 |
| 873.0 | 0 |
| 872.0 | 0.006 |
| 871.0 | 0.012 |
| 870.0 | 0.017 |
| 869.0 | 0.021 |
| 868.0 | 0.015 |
| 867.0 | 0.006 |
| 866.0 | 0 |
| 865.0 | 0.002 |
| 864.0 | 0.011 |
| 863.0 | 0.012 |
| 862.0 | 0.003 |
| 861.0 | 0.002 |
| 860.0 | 0.002 |
| 859.0 | 0.001 |
| 858.0 | 0.005 |
| 857.0 | 0.006 |
| 856.0 | 0.005 |
| 855.0 | 0.005 |
| 854.0 | 0.006 |
| 853.0 | 0.004 |
| 852.0 | 0.004 |
| 851.0 | 0.004 |
| 850.0 | 0.003 |
| 849.0 | 0.004 |
| 848.0 | 0.003 |
| 847.0 | 0.002 |
| 846.0 | 0.007 |
| 845.0 | 0.008 |
| 844.0 | 0.006 |
| 843.0 | 0.007 |
| 842.0 | 0.009 |
| 841.0 | 0.007 |
| 840.0 | 0.004 |
| 839.0 | 0.007 |
| 838.0 | 0.008 |
| 837.0 | 0.005 |
| 836.0 | 0.004 |
| 835.0 | 0.008 |
| 834.0 | 0.01 |
| 833.0 | 0.01 |
| 832.0 | 0.011 |
| 831.0 | 0.011 |
| 830.0 | 0.009 |
| 829.0 | 0.006 |
| 828.0 | 0.007 |
| 827.0 | 0.006 |
| 826.0 | 0.006 |
| 825.0 | 0.006 |
| 824.0 | 0.008 |
| 823.0 | 0.009 |
| 822.0 | 0.009 |
| 821.0 | 0.005 |
| 820.0 | 0.007 |
| 819.0 | 0.01 |
| 818.0 | 0.009 |
| 817.0 | 0.006 |
| 816.0 | 0.01 |
| 815.0 | 0.011 |
| 814.0 | 0.009 |
| 813.0 | 0.007 |
| 812.0 | 0.006 |
| 811.0 | 0.005 |
| 810.0 | 0.005 |
| 809.0 | 0.006 |
| 808.0 | 0.006 |
| 807.0 | 0.005 |
| 806.0 | 0.004 |
| 805.0 | 0.005 |
| 804.0 | 0.009 |
| 803.0 | 0.013 |
| 802.0 | 0.088 |
| 801.0 | 0.402 |
| 800.0 | 1.064 |
| 799.0 | 2.123 |
| 798.0 | 3.224 |
| 797.0 | 4.514 |
| 796.0 | 5.225 |
| 795.0 | 5.663 |
| 794.0 | 5.807 |
| 793.0 | 5.869 |
| 792.0 | 5.857 |
| 791.0 | 5.832 |
| 790.0 | 5.885 |
| 789.0 | 6.003 |
| 788.0 | 6.034 |
| 787.0 | 6.001 |
| 786.0 | 6.003 |
| 785.0 | 6.026 |
| 784.0 | 6.044 |
| 783.0 | 6.076 |
| 782.0 | 6.092 |
| 781.0 | 6.055 |
| 780.0 | 6.098 |
| 779.0 | 6.03 |
| 778.0 | 5.906 |
| 777.0 | 5.662 |
| 776.0 | 4.931 |
| 775.0 | 4.146 |
| 774.0 | 2.704 |
| 773.0 | 1.311 |
| 772.0 | 0.482 |
| 771.0 | 0.147 |
| 770.0 | 0.043 |
| 769.0 | 0.016 |
| 768.0 | 0.007 |
| 767.0 | 0.005 |
| 766.0 | 0.005 |
| 765.0 | 0.007 |
| 764.0 | 0.007 |
| 763.0 | 0.006 |
| 762.0 | 0.005 |
| 761.0 | 0.007 |
| 760.0 | 0.011 |
| 759.0 | 0.011 |
| 758.0 | 0.008 |
| 757.0 | 0.011 |
| 756.0 | 0.01 |
| 755.0 | 0.007 |
| 754.0 | 0.007 |
| 753.0 | 0.008 |
| 752.0 | 0.007 |
| 751.0 | 0.008 |
| 750.0 | 0.009 |
| 749.0 | 0.009 |
| 748.0 | 0.007 |
| 747.0 | 0.008 |
| 746.0 | 0.007 |
| 745.0 | 0.008 |
| 744.0 | 0.007 |
| 743.0 | 0.009 |
| 742.0 | 0.008 |
| 741.0 | 0.007 |
| 740.0 | 0.009 |
| 739.0 | 0.007 |
| 738.0 | 0.006 |
| 737.0 | 0.008 |
| 736.0 | 0.007 |
| 735.0 | 0.008 |
| 734.0 | 0.004 |
| 733.0 | 0.007 |
| 732.0 | 0.003 |
| 731.0 | 0.004 |
| 730.0 | 0.009 |
| 729.0 | 0.008 |
| 728.0 | 0.006 |
| 727.0 | 0.006 |
| 726.0 | 0.006 |
| 725.0 | 0.007 |
| 724.0 | 0.007 |
| 723.0 | 0.006 |
| 722.0 | 0.006 |
| 721.0 | 0.008 |
| 720.0 | 0.005 |
| 719.0 | 0.003 |
| 718.0 | 0.003 |
| 717.0 | 0.003 |
| 716.0 | 0.002 |
| 715.0 | 0.004 |
| 714.0 | 0.001 |
| 713.0 | 0.003 |
| 712.0 | 0.002 |
| 711.0 | 0.004 |
| 710.0 | 0.004 |
| 709.0 | 0.004 |
| 708.0 | 0.004 |
| 707.0 | 0.005 |
| 706.0 | 0.002 |
| 705.0 | 0.006 |
| 704.0 | 0.004 |
| 703.0 | 0.004 |
| 702.0 | 0.004 |
| 701.0 | 0.003 |
| 700.0 | 0.006 |
| 699.0 | 0.004 |
| 698.0 | 0.005 |
| 697.0 | 0.006 |
| 696.0 | 0.007 |
| 695.0 | 0.006 |
| 694.0 | 0.008 |
| 693.0 | 0.007 |
| 692.0 | 0.008 |
| 691.0 | 0.007 |
| 690.0 | 0.005 |
| 689.0 | 0.007 |
| 688.0 | 0.008 |
| 687.0 | 0.009 |
| 686.0 | 0.005 |
| 685.0 | 0.008 |
| 684.0 | 0.007 |
| 683.0 | 0.008 |
| 682.0 | 0.008 |
| 681.0 | 0.006 |
| 680.0 | 0.007 |
| 679.0 | 0.008 |
| 678.0 | 0.007 |
| 677.0 | 0.008 |
| 676.0 | 0.007 |
| 675.0 | 0.006 |
| 674.0 | 0.007 |
| 673.0 | 0.007 |
| 672.0 | 0.008 |
| 671.0 | 0.009 |
| 670.0 | 0.009 |
| 669.0 | 0.008 |
| 668.0 | 0.009 |
| 667.0 | 0.011 |
| 666.0 | 0.008 |
| 665.0 | 0.005 |
| 664.0 | 0.01 |
| 663.0 | 0.006 |
| 662.0 | 0.005 |
| 661.0 | 0.005 |
| 660.0 | 0.005 |
| 659.0 | 0.006 |
| 658.0 | 0.005 |
| 657.0 | 0.005 |
| 656.0 | 0.005 |
| 655.0 | 0.005 |
| 654.0 | 0.007 |
| 653.0 | 0.006 |
| 652.0 | 0.006 |
| 651.0 | 0.005 |
| 650.0 | 0.004 |
| 649.0 | 0.007 |
| 648.0 | 0.006 |
| 647.0 | 0.005 |
| 646.0 | 0.006 |
| 645.0 | 0.005 |
| 644.0 | 0.004 |
| 643.0 | 0.005 |
| 642.0 | 0.005 |
| 641.0 | 0.004 |
| 640.0 | 0.003 |
| 639.0 | 0.002 |
| 638.0 | 0.005 |
| 637.0 | 0.005 |
| 636.0 | 0.003 |
| 635.0 | 0.005 |
| 634.0 | 0.005 |
| 633.0 | 0.006 |
| 632.0 | 0.006 |
| 631.0 | 0.008 |
| 630.0 | 0.003 |
| 629.0 | 0.005 |
| 628.0 | 0.005 |
| 627.0 | 0.004 |
| 626.0 | 0.005 |
| 625.0 | 0.004 |
| 624.0 | 0.004 |
| 623.0 | 0.006 |
| 622.0 | 0.004 |
| 621.0 | 0.005 |
| 620.0 | 0.003 |
| 619.0 | 0.003 |
| 618.0 | 0.006 |
| 617.0 | 0.007 |
| 616.0 | 0.006 |
| 615.0 | 0.007 |
| 614.0 | 0.005 |
| 613.0 | 0.005 |
| 612.0 | 0.004 |
| 611.0 | 0.004 |
| 610.0 | 0.005 |
| 609.0 | 0.004 |
| 608.0 | 0.002 |
| 607.0 | 0.001 |
| 606.0 | 0.001 |
| 605.0 | 0.003 |
| 604.0 | 0.001 |
| 603.0 | 0.001 |
| 602.0 | 0 |
| 601.0 | 0.001 |
| 600.0 | 0.002 |
| 599.0 | 0.001 |
| 598.0 | 0.001 |
| 597.0 | 0.002 |
| 596.0 | 0.001 |
| 595.0 | 0.003 |
| 594.0 | 0 |
| 593.0 | 0.001 |
| 592.0 | 0 |
| 591.0 | 0.002 |
| 590.0 | 0.004 |
| 589.0 | 0.007 |
| 588.0 | 0.007 |
| 587.0 | 0.007 |
| 586.0 | 0.007 |
| 585.0 | 0.007 |
| 584.0 | 0.008 |
| 583.0 | 0.008 |
| 582.0 | 0.01 |
| 581.0 | 0.021 |
| 580.0 | 0.052 |
| 579.0 | 0.08 |
| 578.0 | 0.09 |
| 577.0 | 0.104 |
| 576.0 | 0.13 |
| 575.0 | 0.154 |
| 574.0 | 0.177 |
| 573.0 | 0.234 |
| 572.0 | 0.299 |
| 571.0 | 0.339 |
| 570.0 | 0.355 |
| 569.0 | 0.349 |
| 568.0 | 0.352 |
| 567.0 | 0.352 |
| 566.0 | 0.343 |
| 565.0 | 0.339 |
| 564.0 | 0.354 |
| 563.0 | 0.403 |
| 562.0 | 0.494 |
| 561.0 | 0.592 |
| 560.0 | 0.66 |
| 559.0 | 0.741 |
| 558.0 | 0.813 |
| 557.0 | 0.822 |
| 556.0 | 0.826 |
| 555.0 | 0.887 |
| 554.0 | 0.993 |
| 553.0 | 1.104 |
| 552.0 | 1.175 |
| 551.0 | 1.207 |
| 550.0 | 1.262 |
| 549.0 | 1.365 |
| 548.0 | 1.5 |
| 547.0 | 1.639 |
| 546.0 | 1.701 |
| 545.0 | 1.753 |
| 544.0 | 1.925 |
| 543.0 | 2.17 |
| 542.0 | 2.342 |
| 541.0 | 2.505 |
| 540.0 | 2.784 |
| 539.0 | 3.221 |
| 538.0 | 3.754 |
| 537.0 | 5.009 |
| 536.0 | 4.33 |
| 535.0 | 4.282 |
| 534.0 | 4.472 |
| 533.0 | 4.362 |
| 532.0 | 4.817 |
| 531.0 | 4.548 |
| 530.0 | 4.256 |
| 529.0 | 4.255 |
| 528.0 | 4.273 |
| 527.0 | 4.472 |
| 526.0 | 4.884 |
| 525.0 | 4.444 |
| 524.0 | 4.238 |
| 523.0 | 4.246 |
| 522.0 | 4.23 |
| 521.0 | 4.406 |
| 520.0 | 4.758 |
| 519.0 | 4.582 |
| 518.0 | 4.214 |
| 517.0 | 4.23 |
| 516.0 | 4.246 |
| 515.0 | 4.382 |
| 514.0 | 4.786 |
| 513.0 | 4.499 |
| 512.0 | 4.237 |
| 511.0 | 4.289 |
| 510.0 | 4.299 |
| 509.0 | 4.499 |
| 508.0 | 4.785 |
| 507.0 | 4.53 |
| 506.0 | 4.289 |
| 505.0 | 4.28 |
| 504.0 | 4.289 |
| 503.0 | 4.484 |
| 502.0 | 4.682 |
| 501.0 | 4.456 |
| 500.0 | 4.228 |
| 499.0 | 4.417 |
| 498.0 | 4.417 |
| 497.0 | 4.429 |
| 496.0 | 4.881 |
| 495.0 | 4.442 |
| 494.0 | 4.19 |
| 493.0 | 4.22 |
| 492.0 | 4.298 |
| 491.0 | 4.469 |
| 490.0 | 4.881 |
| 489.0 | 4.545 |
| 488.0 | 4.279 |
| 487.0 | 4.261 |
| 486.0 | 4.297 |
| 485.0 | 4.513 |
| 484.0 | 4.784 |
| 483.0 | 4.416 |
| 482.0 | 4.227 |
| 481.0 | 4.219 |
| 480.0 | 4.227 |
| 479.0 | 4.428 |
| 478.0 | 4.704 |
| 477.0 | 4.403 |
| 476.0 | 4.188 |
| 475.0 | 4.335 |
| 474.0 | 4.414 |
| 473.0 | 4.39 |
| 472.0 | 4.561 |
| 471.0 | 4.346 |
| 470.0 | 4.187 |
| 469.0 | 4.324 |
| 468.0 | 4.414 |
| 467.0 | 4.495 |
| 466.0 | 4.679 |
| 465.0 | 4.377 |
| 464.0 | 4.225 |
| 463.0 | 4.217 |
| 462.0 | 4.225 |
| 461.0 | 4.377 |
| 460.0 | 4.656 |
| 459.0 | 4.451 |
| 458.0 | 4.216 |
| 457.0 | 4.248 |
| 456.0 | 4.343 |
| 455.0 | 4.558 |
| 454.0 | 5.001 |
| 453.0 | 4.451 |
| 452.0 | 4.215 |
| 451.0 | 4.239 |
| 450.0 | 4.283 |
| 449.0 | 4.478 |
| 448.0 | 4.724 |
| 447.0 | 4.375 |
| 446.0 | 4.23 |
| 445.0 | 4.311 |
| 444.0 | 4.331 |
| 443.0 | 4.492 |
| 442.0 | 4.724 |
| 441.0 | 4.386 |
| 440.0 | 4.246 |
| 439.0 | 4.409 |
| 438.0 | 4.362 |
| 437.0 | 4.491 |
| 436.0 | 4.839 |
| 435.0 | 4.396 |
| 434.0 | 4.299 |
| 433.0 | 4.253 |
| 432.0 | 4.289 |
| 431.0 | 4.49 |
| 430.0 | 4.838 |
| 429.0 | 4.384 |
| 428.0 | 4.298 |
| 427.0 | 4.328 |
| 426.0 | 4.36 |
| 425.0 | 4.474 |
| 424.0 | 4.72 |
| 423.0 | 4.371 |
| 422.0 | 4.288 |
| 421.0 | 4.218 |
| 420.0 | 4.306 |
| 419.0 | 4.671 |
| 418.0 | 5.171 |
| 417.0 | 4.359 |
| 416.0 | 4.201 |
| 415.0 | 4.25 |
| 414.0 | 4.336 |
| 413.0 | 4.569 |
| 412.0 | 5.046 |
| 411.0 | 4.336 |
| 410.0 | 4.305 |
| 409.0 | 4.335 |
| 408.0 | 4.285 |
| 407.0 | 4.625 |
| 406.0 | 4.834 |
| 405.0 | 4.368 |
| 404.0 | 4.275 |
| 403.0 | 4.428 |
| 402.0 | 4.356 |
| 401.0 | 4.585 |
| 400.0 | 4.8 |
| 399.0 | 4.323 |
| 398.0 | 4.23 |
| 397.0 | 4.454 |
| 396.0 | 4.283 |
| 395.0 | 4.603 |
| 394.0 | 4.715 |
| 393.0 | 4.332 |
| 392.0 | 4.254 |
| 391.0 | 4.272 |
| 390.0 | 4.245 |
| 389.0 | 4.83 |
| 388.0 | 4.564 |
| 387.0 | 3.923 |
| 386.0 | 3.676 |
| 385.0 | 3.332 |
| 384.0 | 2.383 |
| 383.0 | 1.883 |
| 382.0 | 1.741 |
| 381.0 | 1.934 |
| 380.0 | 2.445 |
| 379.0 | 2.981 |
| 378.0 | 3.194 |
| 377.0 | 3.4 |
| 376.0 | 3.7 |
| 375.0 | 3.919 |
| 374.0 | 3.694 |
| 373.0 | 3.333 |
| 372.0 | 2.992 |
| 371.0 | 2.774 |
| 370.0 | 2.777 |
| 369.0 | 3.015 |
| 368.0 | 3.394 |
| 367.0 | 3.517 |
| 366.0 | 3.262 |
| 365.0 | 2.792 |
| 364.0 | 2.523 |
| 363.0 | 2.427 |
| 362.0 | 2.454 |
| 361.0 | 2.62 |
| 360.0 | 2.994 |
| 359.0 | 3.52 |
| 358.0 | 3.816 |
| 357.0 | 3.787 |
| 356.0 | 3.887 |
| 355.0 | 3.849 |
| 354.0 | 4.129 |
| 353.0 | 4.613 |
| 352.0 | 4.504 |
| 351.0 | 4.893 |
| 350.0 | 4.322 |
| 349.0 | 5.032 |
| 348.0 | 4.855 |
| 347.0 | 4.633 |
| 346.0 | 4.244 |
| 345.0 | 4.632 |
| 344.0 | 4.252 |
| 343.0 | 4.591 |
| 342.0 | 4.703 |
| 341.0 | 4.401 |
| 340.0 | 4.289 |
| 339.0 | 4.818 |
| 338.0 | 4.299 |
| 337.0 | 5.233 |
| 336.0 | 4.932 |
| 335.0 | 4.57 |
| 334.0 | 4.25 |
| 333.0 | 4.484 |
| 332.0 | 4.329 |
| 331.0 | 4.755 |
| 330.0 | 5.027 |
| 329.0 | 4.328 |
| 328.0 | 4.223 |
| 327.0 | 4.515 |
| 326.0 | 4.317 |
| 325.0 | 4.725 |
| 324.0 | 4.783 |
| 323.0 | 4.306 |
| 322.0 | 4.338 |
| 321.0 | 4.497 |
| 320.0 | 4.327 |
| 319.0 | 4.627 |
| 318.0 | 4.272 |
| 317.0 | 4.292 |
| 316.0 | 4.253 |
| 315.0 | 4.846 |
| 314.0 | 4.345 |
| 313.0 | 5.146 |
| 312.0 | 4.97 |
| 311.0 | 4.392 |
| 310.0 | 4.153 |
| 309.0 | 5.078 |
| 308.0 | 4.28 |
| 307.0 | 4.923 |
| 306.0 | 4.58 |
| 305.0 | 4.391 |
| 304.0 | 4.182 |
| 303.0 | 4.377 |
| 302.0 | 4.33 |
| 301.0 | 5.921 |
| 300.0 | 4.775 |
| 299.0 | 4.376 |
| 298.0 | 4.157 |
| 297.0 | 4.473 |
| 296.0 | 4.286 |
| 295.0 | 5.318 |
| 294.0 | 4.773 |
| 293.0 | 4.306 |
| 292.0 | 4.256 |
| 291.0 | 4.275 |
| 290.0 | 4.285 |
| 289.0 | 5.316 |
| 288.0 | 4.963 |
| 287.0 | 4.305 |
| 286.0 | 4.185 |
| 285.0 | 4.962 |
| 284.0 | 4.263 |
| 283.0 | 4.962 |
| 282.0 | 4.875 |
| 281.0 | 4.293 |
| 280.0 | 4.262 |
| 279.0 | 4.302 |
| 278.0 | 4.324 |
| 277.0 | 4.836 |
| 276.0 | 4.71 |
| 275.0 | 4.261 |
| 274.0 | 4.251 |
| 273.0 | 4.27 |
| 272.0 | 4.312 |
| 271.0 | 4.683 |
| 270.0 | 5.01 |
| 269.0 | 4.181 |
| 268.0 | 4.26 |
| 267.0 | 4.533 |
| 266.0 | 4.799 |
| 265.0 | 4.682 |
| 264.0 | 4.958 |
| 263.0 | 4.25 |
| 262.0 | 4.332 |
| 261.0 | 4.589 |
| 260.0 | 4.299 |
| 259.0 | 4.589 |
| 258.0 | 5.066 |
| 257.0 | 4.212 |
| 256.0 | 4.366 |
| 255.0 | 4.609 |
| 254.0 | 4.319 |
| 253.0 | 4.608 |
| 252.0 | 4.511 |
| 251.0 | 4.123 |
| 250.0 | 4.255 |
| 249.0 | 4.209 |
| 248.0 | 4.328 |
| 247.0 | 4.652 |
| 246.0 | 4.652 |
| 245.0 | 4.226 |
| 244.0 | 4.294 |
| 243.0 | 4.827 |
| 242.0 | 4.304 |
| 241.0 | 4.793 |
| 240.0 | 5.208 |
| 239.0 | 4.199 |
| 238.0 | 4.253 |
| 237.0 | 4.216 |
| 236.0 | 4.375 |
| 235.0 | 4.866 |
| 234.0 | 4.628 |
| 233.0 | 4.182 |
| 232.0 | 4.263 |
| 231.0 | 4.65 |
| 230.0 | 4.206 |
| 229.0 | 4.791 |
| 228.0 | 4.543 |
| 227.0 | 4.26 |
| 226.0 | 4.187 |
| 225.0 | 4.397 |
| 224.0 | 4.22 |
| 223.0 | 4.645 |
| 222.0 | 4.599 |
| 221.0 | 4.297 |
| 220.0 | 4.174 |
| 219.0 | 4.555 |
| 218.0 | 4.189 |
| 217.0 | 4.781 |
| 216.0 | 4.418 |
| 215.0 | 4.25 |
| 214.0 | 4.122 |
| 213.0 | 4.55 |
| 212.0 | 4.21 |
| 211.0 | 4.635 |
| 210.0 | 4.427 |
| 209.0 | 4.245 |
| 208.0 | 4.089 |
| 207.0 | 4.244 |
| 206.0 | 4.17 |
| 205.0 | 4.454 |
| 204.0 | 4.272 |
| 203.0 | 4.099 |
| 202.0 | 4.02 |
| 201.0 | 3.953 |
| 200.0 | 3.947 |